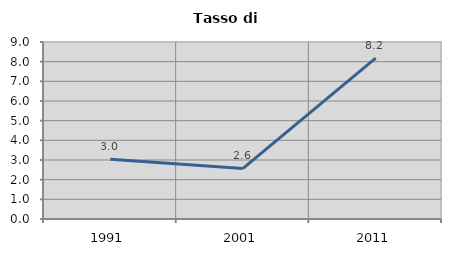
| Category | Tasso di disoccupazione   |
|---|---|
| 1991.0 | 3.043 |
| 2001.0 | 2.572 |
| 2011.0 | 8.176 |